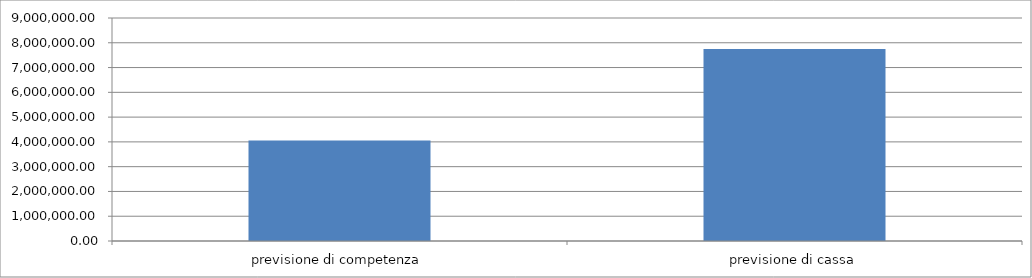
| Category | Series 0 |
|---|---|
| previsione di competenza | 4053334 |
| previsione di cassa | 7748466.25 |